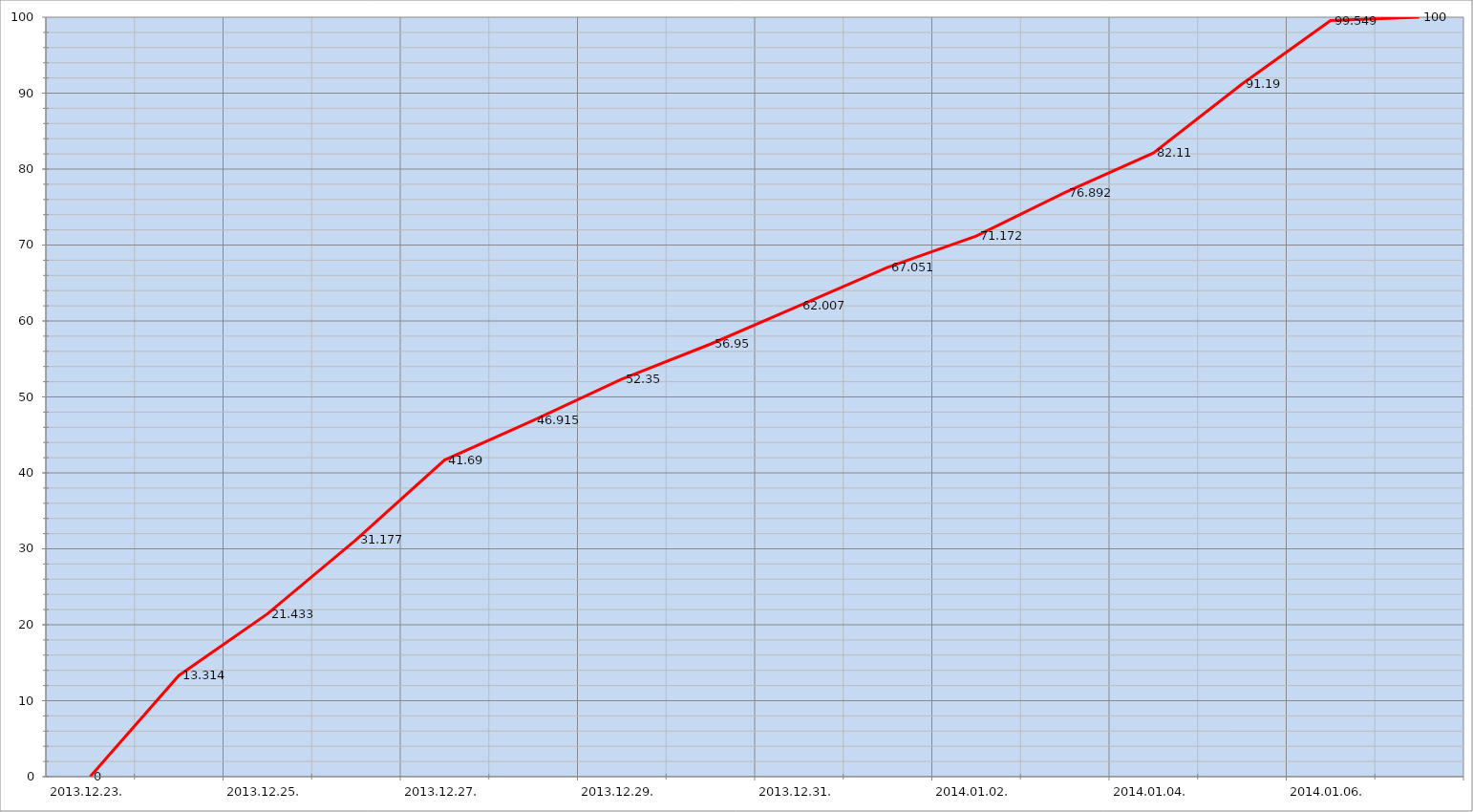
| Category | Szerver 9 |
|---|---|
| 2013-12-23 | 0 |
| 2013-12-24 | 13.314 |
| 2013-12-25 | 21.433 |
| 2013-12-26 | 31.177 |
| 2013-12-27 | 41.69 |
| 2013-12-28 | 46.915 |
| 2013-12-29 | 52.35 |
| 2013-12-30 | 56.95 |
| 2013-12-31 | 62.007 |
| 2014-01-01 | 67.051 |
| 2014-01-02 | 71.172 |
| 2014-01-03 | 76.892 |
| 2014-01-04 | 82.11 |
| 2014-01-05 | 91.19 |
| 2014-01-06 | 99.549 |
| 2014-01-07 | 100 |